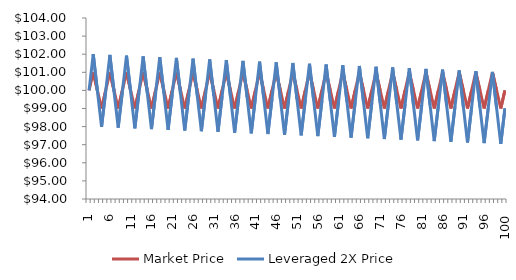
| Category | Market Price | Leveraged 2X Price |
|---|---|---|
| 1.0 | 100 | 100 |
| 2.0 | 101 | 102 |
| 3.0 | 100 | 99.98 |
| 4.0 | 99 | 97.981 |
| 5.0 | 100 | 99.96 |
| 6.0 | 101 | 101.959 |
| 7.0 | 100 | 99.94 |
| 8.0 | 99 | 97.941 |
| 9.0 | 100 | 99.92 |
| 10.0 | 101 | 101.918 |
| 11.0 | 100 | 99.9 |
| 12.0 | 99 | 97.902 |
| 13.0 | 100 | 99.88 |
| 14.0 | 101 | 101.878 |
| 15.0 | 100 | 99.86 |
| 16.0 | 99 | 97.863 |
| 17.0 | 100 | 99.84 |
| 18.0 | 101 | 101.837 |
| 19.0 | 100 | 99.82 |
| 20.0 | 99 | 97.824 |
| 21.0 | 100 | 99.8 |
| 22.0 | 101 | 101.796 |
| 23.0 | 100 | 99.78 |
| 24.0 | 99 | 97.785 |
| 25.0 | 100 | 99.76 |
| 26.0 | 101 | 101.755 |
| 27.0 | 100 | 99.74 |
| 28.0 | 99 | 97.746 |
| 29.0 | 100 | 99.72 |
| 30.0 | 101 | 101.715 |
| 31.0 | 100 | 99.701 |
| 32.0 | 99 | 97.707 |
| 33.0 | 100 | 99.68 |
| 34.0 | 101 | 101.674 |
| 35.0 | 100 | 99.661 |
| 36.0 | 99 | 97.667 |
| 37.0 | 100 | 99.641 |
| 38.0 | 101 | 101.633 |
| 39.0 | 100 | 99.621 |
| 40.0 | 99 | 97.628 |
| 41.0 | 100 | 99.601 |
| 42.0 | 101 | 101.593 |
| 43.0 | 100 | 99.581 |
| 44.0 | 99 | 97.589 |
| 45.0 | 100 | 99.561 |
| 46.0 | 101 | 101.552 |
| 47.0 | 100 | 99.541 |
| 48.0 | 99 | 97.55 |
| 49.0 | 100 | 99.521 |
| 50.0 | 101 | 101.511 |
| 51.0 | 100 | 99.501 |
| 52.0 | 99 | 97.511 |
| 53.0 | 100 | 99.481 |
| 54.0 | 101 | 101.471 |
| 55.0 | 100 | 99.462 |
| 56.0 | 99 | 97.472 |
| 57.0 | 100 | 99.441 |
| 58.0 | 101 | 101.43 |
| 59.0 | 100 | 99.422 |
| 60.0 | 99 | 97.433 |
| 61.0 | 100 | 99.402 |
| 62.0 | 101 | 101.39 |
| 63.0 | 100 | 99.382 |
| 64.0 | 99 | 97.394 |
| 65.0 | 100 | 99.362 |
| 66.0 | 101 | 101.349 |
| 67.0 | 100 | 99.342 |
| 68.0 | 99 | 97.355 |
| 69.0 | 100 | 99.322 |
| 70.0 | 101 | 101.309 |
| 71.0 | 100 | 99.303 |
| 72.0 | 99 | 97.316 |
| 73.0 | 100 | 99.282 |
| 74.0 | 101 | 101.268 |
| 75.0 | 100 | 99.263 |
| 76.0 | 99 | 97.278 |
| 77.0 | 100 | 99.243 |
| 78.0 | 101 | 101.228 |
| 79.0 | 100 | 99.223 |
| 80.0 | 99 | 97.239 |
| 81.0 | 100 | 99.203 |
| 82.0 | 101 | 101.187 |
| 83.0 | 100 | 99.183 |
| 84.0 | 99 | 97.2 |
| 85.0 | 100 | 99.163 |
| 86.0 | 101 | 101.147 |
| 87.0 | 100 | 99.144 |
| 88.0 | 99 | 97.161 |
| 89.0 | 100 | 99.124 |
| 90.0 | 101 | 101.106 |
| 91.0 | 100 | 99.104 |
| 92.0 | 99 | 97.122 |
| 93.0 | 100 | 99.084 |
| 94.0 | 101 | 101.066 |
| 95.0 | 100 | 99.064 |
| 96.0 | 99 | 97.083 |
| 97.0 | 100 | 99.044 |
| 98.0 | 101 | 101.025 |
| 99.0 | 100 | 99.025 |
| 100.0 | 99 | 97.044 |
| 100.0 | 100 | 99.005 |